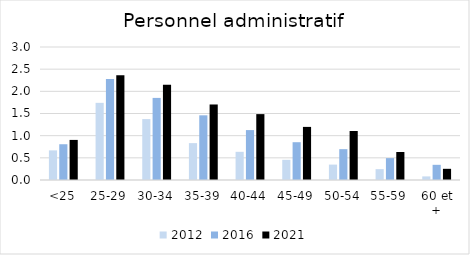
| Category | 2012 | 2016 | 2021 |
|---|---|---|---|
| <25 | 0.668 | 0.807 | 0.904 |
| 25-29 | 1.74 | 2.277 | 2.362 |
| 30-34 | 1.374 | 1.852 | 2.149 |
| 35-39 | 0.832 | 1.459 | 1.703 |
| 40-44 | 0.635 | 1.126 | 1.486 |
| 45-49 | 0.455 | 0.852 | 1.198 |
| 50-54 | 0.347 | 0.696 | 1.106 |
| 55-59 | 0.245 | 0.494 | 0.631 |
| 60 et + | 0.081 | 0.343 | 0.252 |